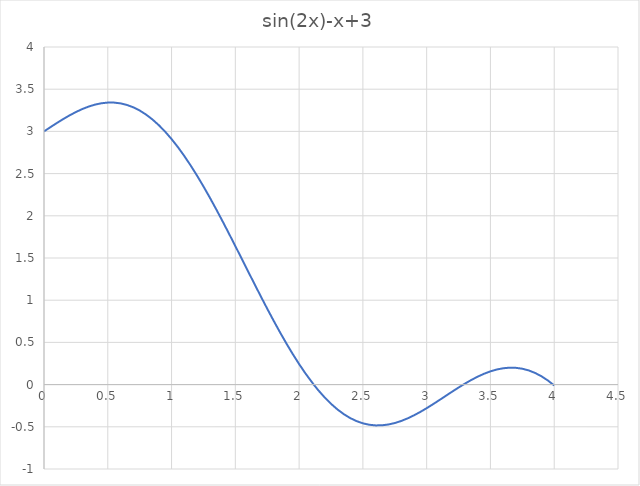
| Category | sin(2x)-x+3 |
|---|---|
| 0.0 | 3 |
| 0.05 | 3.05 |
| 0.1 | 3.099 |
| 0.15 | 3.146 |
| 0.2 | 3.189 |
| 0.25 | 3.229 |
| 0.3 | 3.265 |
| 0.35 | 3.294 |
| 0.4 | 3.317 |
| 0.45 | 3.333 |
| 0.5 | 3.341 |
| 0.55 | 3.341 |
| 0.6 | 3.332 |
| 0.65 | 3.314 |
| 0.7 | 3.285 |
| 0.75 | 3.247 |
| 0.8 | 3.2 |
| 0.85 | 3.142 |
| 0.9 | 3.074 |
| 0.95 | 2.996 |
| 1.0 | 2.909 |
| 1.05 | 2.813 |
| 1.1 | 2.708 |
| 1.15 | 2.596 |
| 1.2 | 2.475 |
| 1.25 | 2.348 |
| 1.3 | 2.216 |
| 1.35 | 2.077 |
| 1.4 | 1.935 |
| 1.45 | 1.789 |
| 1.5 | 1.641 |
| 1.55 | 1.492 |
| 1.6 | 1.342 |
| 1.65 | 1.192 |
| 1.7 | 1.044 |
| 1.75 | 0.899 |
| 1.8 | 0.757 |
| 1.85 | 0.62 |
| 1.9 | 0.488 |
| 1.95 | 0.362 |
| 2.0 | 0.243 |
| 2.05 | 0.132 |
| 2.1146242801686927 | 0 |
| 2.15 | -0.066 |
| 2.2 | -0.152 |
| 2.25 | -0.228 |
| 2.3 | -0.294 |
| 2.35 | -0.35 |
| 2.4 | -0.396 |
| 2.45 | -0.432 |
| 2.5 | -0.459 |
| 2.55 | -0.476 |
| 2.6 | -0.483 |
| 2.65 | -0.482 |
| 2.7 | -0.473 |
| 2.75 | -0.456 |
| 2.8 | -0.431 |
| 2.85 | -0.401 |
| 2.9 | -0.365 |
| 2.95 | -0.324 |
| 3.0 | -0.279 |
| 3.05 | -0.232 |
| 3.1 | -0.183 |
| 3.15 | -0.133 |
| 3.2 | -0.083 |
| 3.25 | -0.035 |
| 3.3 | 0.012 |
| 3.35 | 0.055 |
| 3.4 | 0.094 |
| 3.45 | 0.128 |
| 3.5 | 0.157 |
| 3.55 | 0.179 |
| 3.6 | 0.194 |
| 3.65 | 0.2 |
| 3.7 | 0.199 |
| 3.75 | 0.188 |
| 3.8 | 0.168 |
| 3.85 | 0.138 |
| 3.9 | 0.099 |
| 3.95 | 0.049 |
| 4.0 | -0.011 |